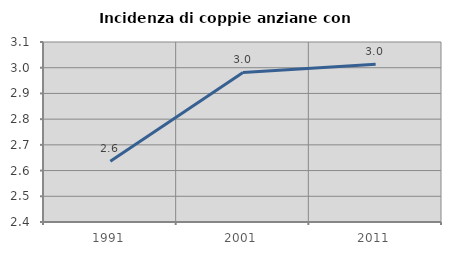
| Category | Incidenza di coppie anziane con figli |
|---|---|
| 1991.0 | 2.636 |
| 2001.0 | 2.981 |
| 2011.0 | 3.013 |